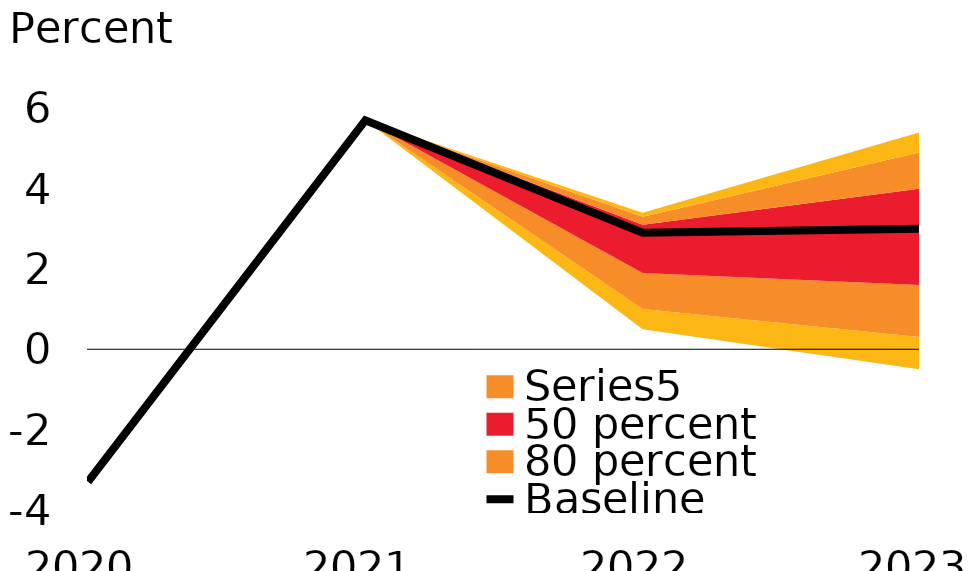
| Category | Baseline |
|---|---|
| 2020.0 | -3.3 |
| 2021.0 | 5.7 |
| 2022.0 | 2.9 |
| 2023.0 | 3 |